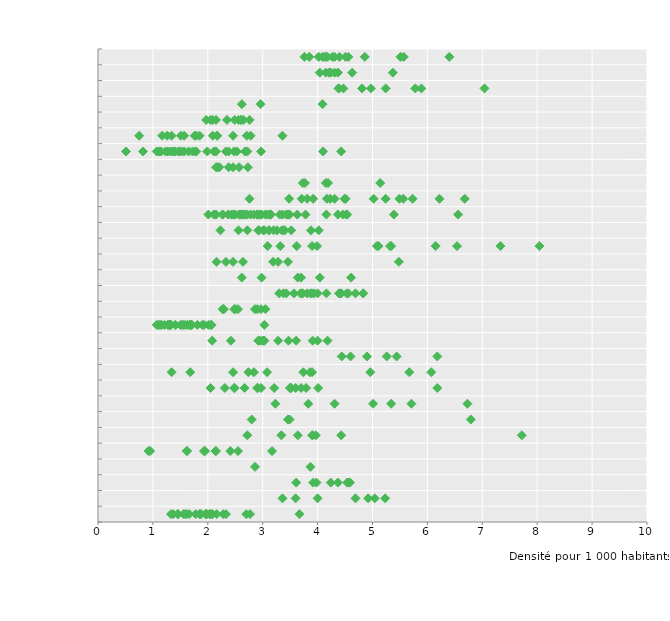
| Category | Series 0 |
|---|---|
| 4.15 | 30.5 |
| 4.56 | 30.5 |
| 5.51 | 30.5 |
| 3.76 | 30.5 |
| 5.57 | 30.5 |
| 6.4 | 30.5 |
| 4.27 | 30.5 |
| 4.4 | 30.5 |
| 3.85 | 30.5 |
| 4.51 | 30.5 |
| 4.02 | 30.5 |
| 4.86 | 30.5 |
| 4.13 | 30.5 |
| 4.09 | 30.5 |
| 4.31 | 30.5 |
| 4.18 | 30.5 |
| 4.15 | 29.5 |
| 4.21 | 29.5 |
| 4.31 | 29.5 |
| 4.24 | 29.5 |
| 4.04 | 29.5 |
| 4.37 | 29.5 |
| 5.37 | 29.5 |
| 4.63 | 29.5 |
| 4.47 | 28.5 |
| 4.81 | 28.5 |
| 7.04 | 28.5 |
| 4.97 | 28.5 |
| 5.24 | 28.5 |
| 4.38 | 28.5 |
| 5.89 | 28.5 |
| 5.78 | 28.5 |
| 4.39 | 28.5 |
| 4.09 | 27.5 |
| 2.62 | 27.5 |
| 2.96 | 27.5 |
| 2.65 | 26.5 |
| 2.09 | 26.5 |
| 2.76 | 26.5 |
| 2.56 | 26.5 |
| 2.61 | 26.5 |
| 2.35 | 26.5 |
| 2.15 | 26.5 |
| 2.05 | 26.5 |
| 2.49 | 26.5 |
| 2.6 | 26.5 |
| 1.97 | 26.5 |
| 0.75 | 25.5 |
| 1.79 | 25.5 |
| 1.57 | 25.5 |
| 1.51 | 25.5 |
| 2.78 | 25.5 |
| 3.36 | 25.5 |
| 1.76 | 25.5 |
| 2.46 | 25.5 |
| 1.85 | 25.5 |
| 2.17 | 25.5 |
| 2.17 | 25.5 |
| 1.26 | 25.5 |
| 2.71 | 25.5 |
| 2.09 | 25.5 |
| 1.34 | 25.5 |
| 1.17 | 25.5 |
| 2.48 | 24.5 |
| 2.97 | 24.5 |
| 4.43 | 24.5 |
| 1.99 | 24.5 |
| 1.65 | 24.5 |
| 2.11 | 24.5 |
| 1.07 | 24.5 |
| 1.32 | 24.5 |
| 1.79 | 24.5 |
| 1.37 | 24.5 |
| 1.11 | 24.5 |
| 0.82 | 24.5 |
| 2.38 | 24.5 |
| 1.23 | 24.5 |
| 1.4 | 24.5 |
| 1.52 | 24.5 |
| 1.72 | 24.5 |
| 1.27 | 24.5 |
| 2.15 | 24.5 |
| 2.68 | 24.5 |
| 2.33 | 24.5 |
| 1.48 | 24.5 |
| 1.57 | 24.5 |
| 2.72 | 24.5 |
| 1.41 | 24.5 |
| 1.47 | 24.5 |
| 1.15 | 24.5 |
| 4.1 | 24.5 |
| 1.77 | 24.5 |
| 2.53 | 24.5 |
| 1.38 | 24.5 |
| 0.51 | 24.5 |
| 2.73 | 23.5 |
| 2.46 | 23.5 |
| 2.38 | 23.5 |
| 2.57 | 23.5 |
| 2.18 | 23.5 |
| 2.21 | 23.5 |
| 2.15 | 23.5 |
| 5.14 | 22.5 |
| 3.73 | 22.5 |
| 4.15 | 22.5 |
| 4.19 | 22.5 |
| 3.77 | 22.5 |
| 4.51 | 21.5 |
| 4.49 | 21.5 |
| 6.22 | 21.5 |
| 5.24 | 21.5 |
| 6.68 | 21.5 |
| 3.48 | 21.5 |
| 5.49 | 21.5 |
| 5.56 | 21.5 |
| 3.92 | 21.5 |
| 2.76 | 21.5 |
| 4.17 | 21.5 |
| 4.23 | 21.5 |
| 4.31 | 21.5 |
| 5.73 | 21.5 |
| 3.81 | 21.5 |
| 3.71 | 21.5 |
| 5.02 | 21.5 |
| 2.5 | 20.5 |
| 2.9 | 20.5 |
| 2.67 | 20.5 |
| 2.37 | 20.5 |
| 3.15 | 20.5 |
| 3.15 | 20.5 |
| 4.16 | 20.5 |
| 2.9 | 20.5 |
| 6.56 | 20.5 |
| 2.96 | 20.5 |
| 2.57 | 20.5 |
| 3.46 | 20.5 |
| 2.01 | 20.5 |
| 3.36 | 20.5 |
| 2.47 | 20.5 |
| 2.43 | 20.5 |
| 2.78 | 20.5 |
| 2.61 | 20.5 |
| 3.12 | 20.5 |
| 3.49 | 20.5 |
| 4.52 | 20.5 |
| 5.39 | 20.5 |
| 3.47 | 20.5 |
| 3.48 | 20.5 |
| 2.15 | 20.5 |
| 3.14 | 20.5 |
| 2.63 | 20.5 |
| 2.84 | 20.5 |
| 2.27 | 20.5 |
| 3.45 | 20.5 |
| 3.63 | 20.5 |
| 2.72 | 20.5 |
| 4.46 | 20.5 |
| 2.91 | 20.5 |
| 2.66 | 20.5 |
| 3.43 | 20.5 |
| 2.27 | 20.5 |
| 3.31 | 20.5 |
| 3.78 | 20.5 |
| 4.54 | 20.5 |
| 2.6 | 20.5 |
| 2.67 | 20.5 |
| 2.91 | 20.5 |
| 2.57 | 20.5 |
| 2.45 | 20.5 |
| 4.37 | 20.5 |
| 3.07 | 20.5 |
| 3.05 | 20.5 |
| 2.98 | 20.5 |
| 2.96 | 20.5 |
| 2.11 | 20.5 |
| 3.88 | 19.5 |
| 2.56 | 19.5 |
| 3.03 | 19.5 |
| 2.92 | 19.5 |
| 3.01 | 19.5 |
| 3.2 | 19.5 |
| 2.93 | 19.5 |
| 3.26 | 19.5 |
| 3.4 | 19.5 |
| 3.52 | 19.5 |
| 3.39 | 19.5 |
| 4.02 | 19.5 |
| 3.11 | 19.5 |
| 2.72 | 19.5 |
| 3.12 | 19.5 |
| 2.23 | 19.5 |
| 3.35 | 19.5 |
| 8.04 | 18.5 |
| 3.62 | 18.5 |
| 3.9 | 18.5 |
| 6.15 | 18.5 |
| 5.34 | 18.5 |
| 6.54 | 18.5 |
| 3.09 | 18.5 |
| 7.33 | 18.5 |
| 5.32 | 18.5 |
| 5.11 | 18.5 |
| 5.08 | 18.5 |
| 3.32 | 18.5 |
| 3.99 | 18.5 |
| 5.48 | 17.5 |
| 2.46 | 17.5 |
| 2.33 | 17.5 |
| 2.64 | 17.5 |
| 3.46 | 17.5 |
| 2.16 | 17.5 |
| 3.19 | 17.5 |
| 3.28 | 17.5 |
| 2.98 | 16.5 |
| 3.7 | 16.5 |
| 4.04 | 16.5 |
| 3.64 | 16.5 |
| 4.61 | 16.5 |
| 2.62 | 16.5 |
| 3.73 | 15.5 |
| 3.69 | 15.5 |
| 4.69 | 15.5 |
| 3.81 | 15.5 |
| 4.42 | 15.5 |
| 4.16 | 15.5 |
| 3.93 | 15.5 |
| 3.89 | 15.5 |
| 3.38 | 15.5 |
| 3.71 | 15.5 |
| 4.43 | 15.5 |
| 4.83 | 15.5 |
| 3.43 | 15.5 |
| 3.3 | 15.5 |
| 3.57 | 15.5 |
| 4.0 | 15.5 |
| 4.39 | 15.5 |
| 4.53 | 15.5 |
| 4.56 | 15.5 |
| 3.87 | 15.5 |
| 4.83 | 15.5 |
| 2.55 | 14.5 |
| 2.29 | 14.5 |
| 2.29 | 14.5 |
| 2.5 | 14.5 |
| 2.48 | 14.5 |
| 2.27 | 14.5 |
| 2.86 | 14.5 |
| 2.9 | 14.5 |
| 3.05 | 14.5 |
| 2.97 | 14.5 |
| 1.71 | 13.5 |
| 1.15 | 13.5 |
| 2.07 | 13.5 |
| 1.81 | 13.5 |
| 1.55 | 13.5 |
| 2.05 | 13.5 |
| 1.15 | 13.5 |
| 1.7 | 13.5 |
| 3.03 | 13.5 |
| 1.5 | 13.5 |
| 1.3 | 13.5 |
| 1.63 | 13.5 |
| 1.41 | 13.5 |
| 1.29 | 13.5 |
| 1.1 | 13.5 |
| 1.3 | 13.5 |
| 1.41 | 13.5 |
| 1.93 | 13.5 |
| 1.21 | 13.5 |
| 1.27 | 13.5 |
| 1.07 | 13.5 |
| 1.32 | 13.5 |
| 1.33 | 13.5 |
| 1.11 | 13.5 |
| 1.67 | 13.5 |
| 1.68 | 13.5 |
| 1.9 | 13.5 |
| 1.58 | 13.5 |
| 1.53 | 13.5 |
| 1.32 | 13.5 |
| 1.63 | 13.5 |
| 2.01 | 13.5 |
| 2.95 | 12.5 |
| 3.47 | 12.5 |
| 2.92 | 12.5 |
| 2.42 | 12.5 |
| 3.03 | 12.5 |
| 3.0 | 12.5 |
| 3.02 | 12.5 |
| 4.18 | 12.5 |
| 4.0 | 12.5 |
| 3.0 | 12.5 |
| 2.08 | 12.5 |
| 3.61 | 12.5 |
| 3.91 | 12.5 |
| 3.28 | 12.5 |
| 4.6 | 11.5 |
| 5.26 | 11.5 |
| 6.18 | 11.5 |
| 5.44 | 11.5 |
| 4.44 | 11.5 |
| 4.9 | 11.5 |
| 5.67 | 10.5 |
| 2.46 | 10.5 |
| 3.08 | 10.5 |
| 2.84 | 10.5 |
| 3.9 | 10.5 |
| 1.34 | 10.5 |
| 6.07 | 10.5 |
| 4.96 | 10.5 |
| 3.86 | 10.5 |
| 1.68 | 10.5 |
| 2.74 | 10.5 |
| 3.74 | 10.5 |
| 3.5 | 9.5 |
| 3.52 | 9.5 |
| 2.9 | 9.5 |
| 3.21 | 9.5 |
| 2.31 | 9.5 |
| 3.7 | 9.5 |
| 2.48 | 9.5 |
| 2.91 | 9.5 |
| 2.49 | 9.5 |
| 3.5 | 9.5 |
| 4.01 | 9.5 |
| 2.97 | 9.5 |
| 3.6 | 9.5 |
| 2.67 | 9.5 |
| 3.79 | 9.5 |
| 6.18 | 9.5 |
| 2.05 | 9.5 |
| 5.71 | 8.5 |
| 4.31 | 8.5 |
| 5.34 | 8.5 |
| 6.73 | 8.5 |
| 3.23 | 8.5 |
| 3.83 | 8.5 |
| 5.01 | 8.5 |
| 6.79 | 7.5 |
| 2.8 | 7.5 |
| 3.46 | 7.5 |
| 3.49 | 7.5 |
| 7.72 | 6.5 |
| 2.72 | 6.5 |
| 3.91 | 6.5 |
| 3.34 | 6.5 |
| 3.64 | 6.5 |
| 4.43 | 6.5 |
| 3.97 | 6.5 |
| 3.9 | 6.5 |
| 2.14 | 5.5 |
| 3.17 | 5.5 |
| 1.93 | 5.5 |
| 0.95 | 5.5 |
| 2.41 | 5.5 |
| 1.95 | 5.5 |
| 0.92 | 5.5 |
| 2.55 | 5.5 |
| 1.62 | 5.5 |
| 2.15 | 5.5 |
| 1.62 | 5.5 |
| 2.86 | 4.5 |
| 3.87 | 4.5 |
| 4.59 | 3.5 |
| 4.56 | 3.5 |
| 3.92 | 3.5 |
| 4.37 | 3.5 |
| 4.24 | 3.5 |
| 3.61 | 3.5 |
| 3.98 | 3.5 |
| 4.54 | 3.5 |
| 5.04 | 2.5 |
| 4.0 | 2.5 |
| 4.69 | 2.5 |
| 5.23 | 2.5 |
| 3.6 | 2.5 |
| 3.36 | 2.5 |
| 4.92 | 2.5 |
| 2.7 | 1.5 |
| 1.96 | 1.5 |
| 1.85 | 1.5 |
| 2.77 | 1.5 |
| 2.03 | 1.5 |
| 1.78 | 1.5 |
| 1.98 | 1.5 |
| 1.88 | 1.5 |
| 3.67 | 1.5 |
| 2.08 | 1.5 |
| 2.33 | 1.5 |
| 1.96 | 1.5 |
| 1.59 | 1.5 |
| 1.61 | 1.5 |
| 2.08 | 1.5 |
| 1.86 | 1.5 |
| 1.56 | 1.5 |
| 1.98 | 1.5 |
| 2.05 | 1.5 |
| 2.28 | 1.5 |
| 1.37 | 1.5 |
| 2.16 | 1.5 |
| 1.45 | 1.5 |
| 1.66 | 1.5 |
| 1.46 | 1.5 |
| 1.33 | 1.5 |